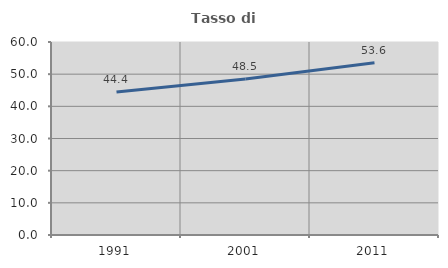
| Category | Tasso di occupazione   |
|---|---|
| 1991.0 | 44.439 |
| 2001.0 | 48.494 |
| 2011.0 | 53.551 |